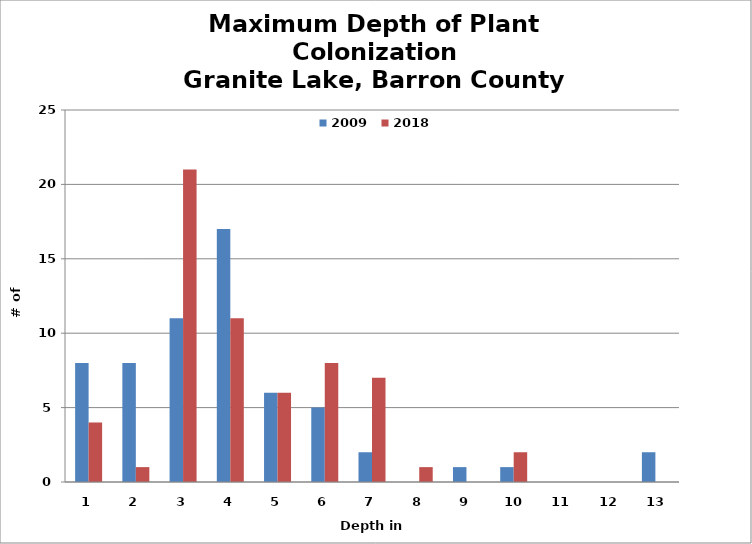
| Category | 2009 | 2018 |
|---|---|---|
| 1.0 | 8 | 4 |
| 2.0 | 8 | 1 |
| 3.0 | 11 | 21 |
| 4.0 | 17 | 11 |
| 5.0 | 6 | 6 |
| 6.0 | 5 | 8 |
| 7.0 | 2 | 7 |
| 8.0 | 0 | 1 |
| 9.0 | 1 | 0 |
| 10.0 | 1 | 2 |
| 11.0 | 0 | 0 |
| 12.0 | 0 | 0 |
| 13.0 | 2 | 0 |